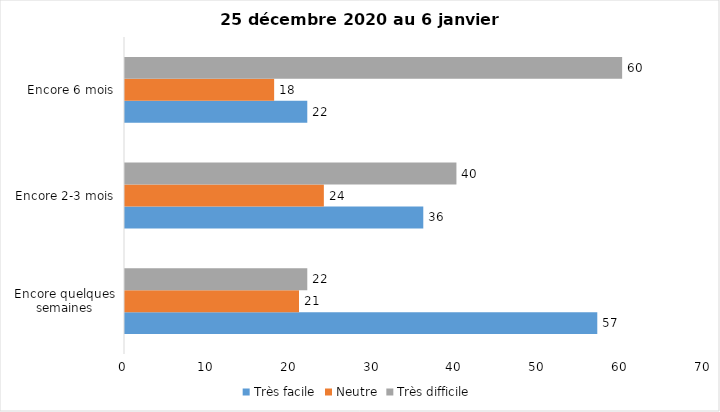
| Category | Très facile | Neutre | Très difficile |
|---|---|---|---|
| Encore quelques semaines | 57 | 21 | 22 |
| Encore 2-3 mois | 36 | 24 | 40 |
| Encore 6 mois | 22 | 18 | 60 |